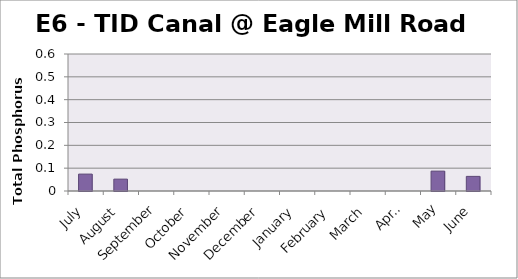
| Category | Phosphorus (mg/L) |
|---|---|
| July | 0.074 |
| August | 0.052 |
| September | 0 |
| October | 0 |
| November | 0 |
| December | 0 |
| January | 0 |
| February | 0 |
| March | 0 |
| April | 0 |
| May | 0.087 |
| June | 0.064 |